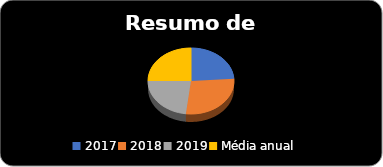
| Category | Series 0 |
|---|---|
| 2017 | 135578.12 |
| 2018 | 158156.74 |
| 2019 | 130725.97 |
| Média anual  | 141486.943 |